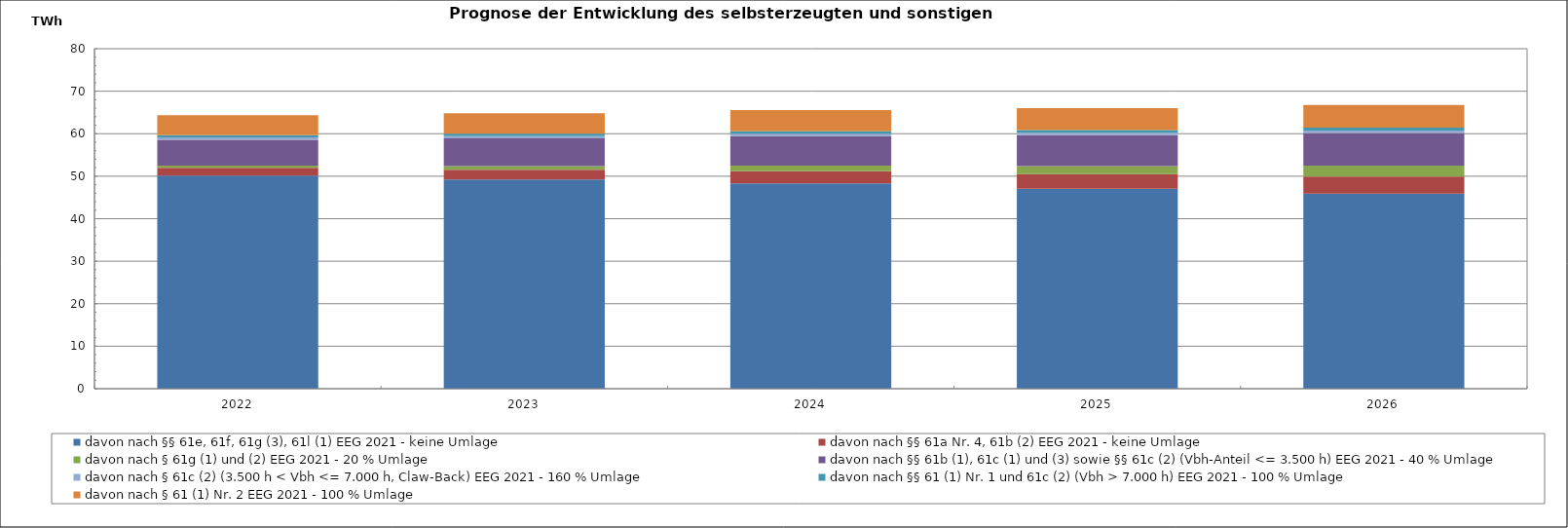
| Category | davon nach §§ 61e, 61f, 61g (3), 61l (1) EEG 2021 - keine Umlage | davon nach §§ 61a Nr. 4, 61b (2) EEG 2021 - keine Umlage | davon nach § 61g (1) und (2) EEG 2021 - 20 % Umlage | davon nach §§ 61b (1), 61c (1) und (3) sowie §§ 61c (2) (Vbh-Anteil <= 3.500 h) EEG 2021 - 40 % Umlage | davon nach § 61c (2) (3.500 h < Vbh <= 7.000 h, Claw-Back) EEG 2021 - 160 % Umlage | davon nach §§ 61 (1) Nr. 1 und 61c (2) (Vbh > 7.000 h) EEG 2021 - 100 % Umlage | davon nach § 61 (1) Nr. 2 EEG 2021 - 100 % Umlage |
|---|---|---|---|---|---|---|---|
| 2022.0 | 50.161 | 1.804 | 0.523 | 6.105 | 0.535 | 0.528 | 4.694 |
| 2023.0 | 49.201 | 2.316 | 0.88 | 6.501 | 0.544 | 0.555 | 4.834 |
| 2024.0 | 48.321 | 2.861 | 1.338 | 6.902 | 0.553 | 0.582 | 4.986 |
| 2025.0 | 47.033 | 3.437 | 1.899 | 7.309 | 0.563 | 0.612 | 5.155 |
| 2026.0 | 45.88 | 4.032 | 2.567 | 7.715 | 0.572 | 0.642 | 5.345 |